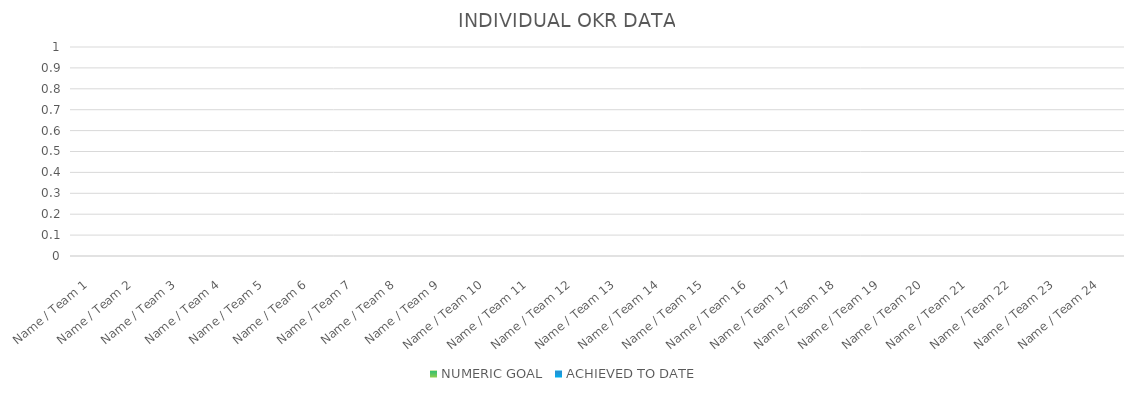
| Category | NUMERIC GOAL | ACHIEVED TO DATE |
|---|---|---|
| Name / Team 1 | 0 | 0 |
| Name / Team 2 | 0 | 0 |
| Name / Team 3 | 0 | 0 |
| Name / Team 4 | 0 | 0 |
| Name / Team 5 | 0 | 0 |
| Name / Team 6 | 0 | 0 |
| Name / Team 7 | 0 | 0 |
| Name / Team 8 | 0 | 0 |
| Name / Team 9 | 0 | 0 |
| Name / Team 10 | 0 | 0 |
| Name / Team 11 | 0 | 0 |
| Name / Team 12 | 0 | 0 |
| Name / Team 13 | 0 | 0 |
| Name / Team 14 | 0 | 0 |
| Name / Team 15 | 0 | 0 |
| Name / Team 16 | 0 | 0 |
| Name / Team 17 | 0 | 0 |
| Name / Team 18 | 0 | 0 |
| Name / Team 19 | 0 | 0 |
| Name / Team 20 | 0 | 0 |
| Name / Team 21 | 0 | 0 |
| Name / Team 22 | 0 | 0 |
| Name / Team 23 | 0 | 0 |
| Name / Team 24 | 0 | 0 |